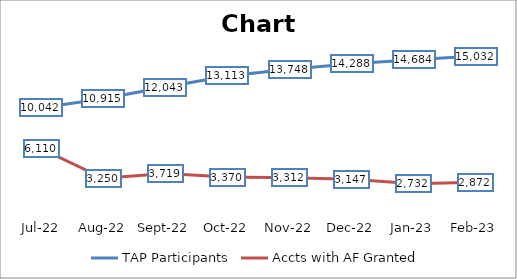
| Category | TAP Participants | Accts with AF Granted |
|---|---|---|
| 2022-07-22 | 10042 | 6110 |
| 2022-08-31 | 10915 | 3250 |
| 2022-09-30 | 12043 | 3719 |
| 2022-10-31 | 13113 | 3370 |
| 2022-11-30 | 13748 | 3312 |
| 2022-12-31 | 14288 | 3147 |
| 2023-01-31 | 14684 | 2732 |
| 2023-02-23 | 15032 | 2872 |